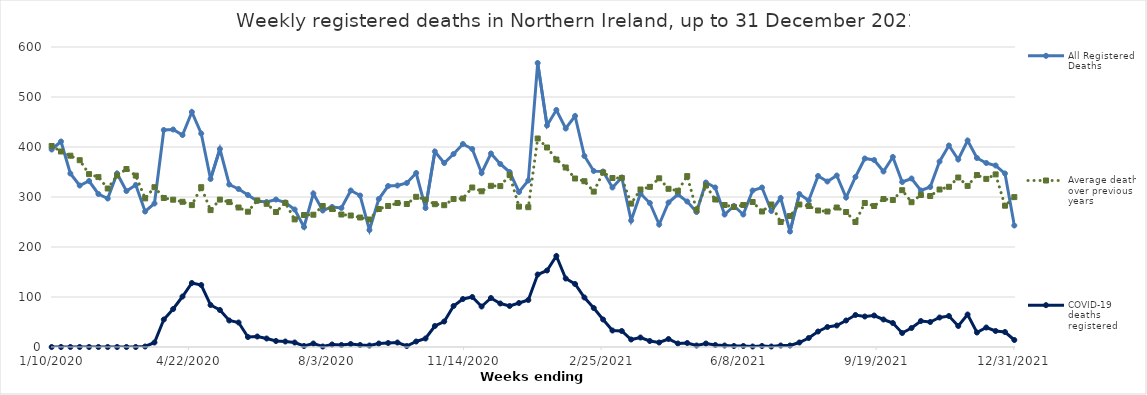
| Category | All Registered Deaths | Average deaths over previous 5 years | COVID-19 deaths registered |
|---|---|---|---|
| 1/10/20 | 395 | 402 | 0 |
| 1/17/20 | 411 | 391 | 0 |
| 1/24/20 | 347 | 382.6 | 0 |
| 1/31/20 | 323 | 373.6 | 0 |
| 2/7/20 | 332 | 345.8 | 0 |
| 2/14/20 | 306 | 339.8 | 0 |
| 2/21/20 | 297 | 317 | 0 |
| 2/28/20 | 347 | 343 | 0 |
| 3/6/20 | 312 | 356 | 0 |
| 3/13/20 | 324 | 342.8 | 0 |
| 3/20/20 | 271 | 297.2 | 1 |
| 3/27/20 | 287 | 319.6 | 9 |
| 4/3/20 | 434 | 298 | 55 |
| 4/10/20 | 435 | 294.6 | 76 |
| 4/17/20 | 424 | 290.4 | 101 |
| 4/24/20 | 470 | 283.8 | 128 |
| 5/1/20 | 427 | 319.6 | 124 |
| 5/8/20 | 336 | 273.8 | 84 |
| 5/15/20 | 396 | 294.8 | 74 |
| 5/22/20 | 325 | 289.8 | 53 |
| 5/29/20 | 316 | 279 | 49 |
| 6/5/20 | 304 | 270.6 | 20 |
| 6/12/20 | 292 | 293.2 | 21 |
| 6/19/20 | 290 | 286.4 | 17 |
| 6/26/20 | 295 | 270 | 12 |
| 7/3/20 | 289 | 288.2 | 11 |
| 7/10/20 | 275 | 255.2 | 9 |
| 7/17/20 | 240 | 264 | 2 |
| 7/24/20 | 307 | 264.6 | 7 |
| 7/31/20 | 273 | 282 | 1 |
| 8/7/20 | 280 | 276 | 5 |
| 8/14/20 | 278 | 265 | 4 |
| 8/21/20 | 313 | 263 | 6 |
| 8/28/20 | 303 | 259 | 4 |
| 9/4/20 | 234 | 255 | 3 |
| 9/11/20 | 296 | 276 | 7 |
| 9/18/20 | 322 | 282 | 8 |
| 9/25/20 | 323 | 288 | 9 |
| 10/2/20 | 328 | 286 | 2 |
| 10/9/20 | 348 | 300.4 | 11 |
| 10/16/20 | 278 | 294.8 | 17 |
| 10/23/20 | 391 | 285.6 | 42 |
| 10/30/20 | 368 | 283.6 | 51 |
| 11/6/20 | 386 | 296 | 82 |
| 11/13/20 | 406 | 297 | 96 |
| 11/20/20 | 396 | 319 | 100 |
| 11/27/20 | 348 | 311.4 | 81 |
| 12/4/20 | 387 | 322.4 | 98 |
| 12/11/20 | 366 | 321.8 | 87 |
| 12/18/20 | 350 | 343.8 | 82 |
| 12/25/20 | 310 | 280.8 | 88 |
| 1/1/21 | 333 | 279.6 | 94 |
| 1/8/21 | 568 | 417 | 145 |
| 1/15/21 | 443 | 399 | 153 |
| 1/22/21 | 474 | 375 | 182 |
| 1/29/21 | 437 | 359 | 137 |
| 2/5/21 | 462 | 337 | 126 |
| 2/12/21 | 382 | 331.6 | 99 |
| 2/19/21 | 352 | 310.8 | 78 |
| 2/26/21 | 351 | 349 | 55 |
| 3/5/21 | 319 | 338 | 33 |
| 3/12/21 | 339 | 338 | 32 |
| 3/19/21 | 253 | 286.8 | 15 |
| 3/26/21 | 307 | 315 | 19 |
| 4/2/21 | 288 | 320.2 | 12 |
| 4/9/21 | 245 | 337.4 | 9 |
| 4/16/21 | 289 | 316.4 | 16 |
| 4/23/21 | 305 | 312.4 | 7 |
| 4/30/21 | 291 | 341.8 | 8 |
| 5/7/21 | 270 | 274 | 3 |
| 5/14/21 | 329 | 323 | 7 |
| 5/21/21 | 319 | 295 | 4 |
| 5/28/21 | 265 | 284 | 3 |
| 6/4/21 | 282 | 280 | 2 |
| 6/11/21 | 265 | 284 | 2 |
| 6/18/21 | 313 | 290 | 1 |
| 6/25/21 | 319 | 271 | 2 |
| 7/2/21 | 272 | 285 | 1 |
| 7/9/21 | 298 | 250 | 3 |
| 7/16/21 | 231 | 262 | 3 |
| 7/23/21 | 306 | 285 | 9 |
| 7/30/21 | 293 | 282 | 18 |
| 8/6/21 | 342 | 273 | 31 |
| 8/13/21 | 331 | 271 | 40 |
| 8/20/21 | 343 | 279 | 43 |
| 8/27/21 | 299 | 270 | 53 |
| 9/3/21 | 340 | 250 | 64 |
| 9/10/21 | 377 | 288 | 61 |
| 9/17/21 | 374 | 282 | 63 |
| 9/24/21 | 351 | 296 | 55 |
| 10/1/21 | 380 | 294 | 48 |
| 10/8/21 | 330 | 313.6 | 28 |
| 10/15/21 | 337 | 289.6 | 38 |
| 10/22/21 | 313 | 304 | 52 |
| 10/29/21 | 320 | 302 | 50 |
| 11/5/21 | 371 | 315 | 59 |
| 11/12/21 | 403 | 320.4 | 62 |
| 11/19/21 | 375 | 339 | 42 |
| 11/26/21 | 413 | 322.2 | 65 |
| 12/3/21 | 378 | 344 | 29 |
| 12/10/21 | 368 | 336.2 | 39 |
| 12/17/21 | 363 | 345.2 | 32 |
| 12/24/21 | 347 | 282.6 | 30 |
| 12/31/21 | 243 | 299.8 | 14 |